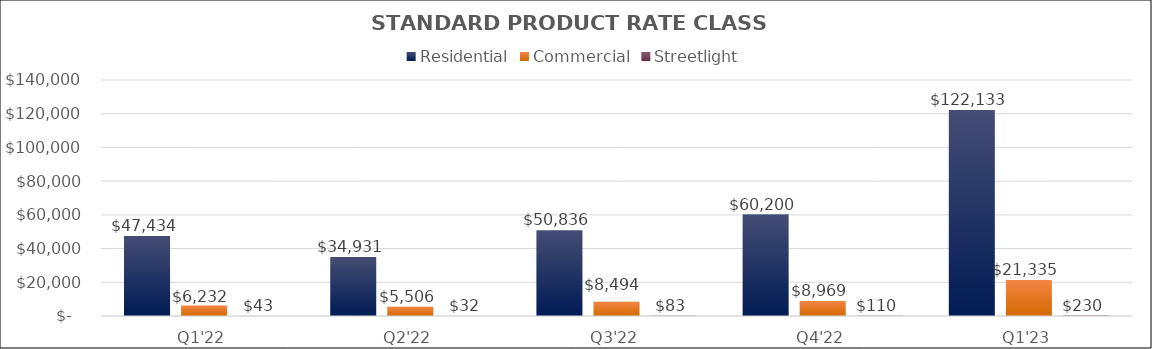
| Category | Residential | Commercial | Streetlight |
|---|---|---|---|
| Q1'22 | 47433.831 | 6232.078 | 43.006 |
| Q2'22 | 34930.937 | 5506.476 | 31.67 |
| Q3'22 | 50835.505 | 8494.17 | 83.495 |
| Q4'22 | 60199.765 | 8969.257 | 109.711 |
| Q1'23 | 122133.298 | 21335.4 | 229.88 |